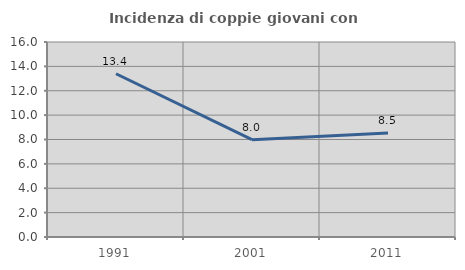
| Category | Incidenza di coppie giovani con figli |
|---|---|
| 1991.0 | 13.393 |
| 2001.0 | 7.986 |
| 2011.0 | 8.534 |